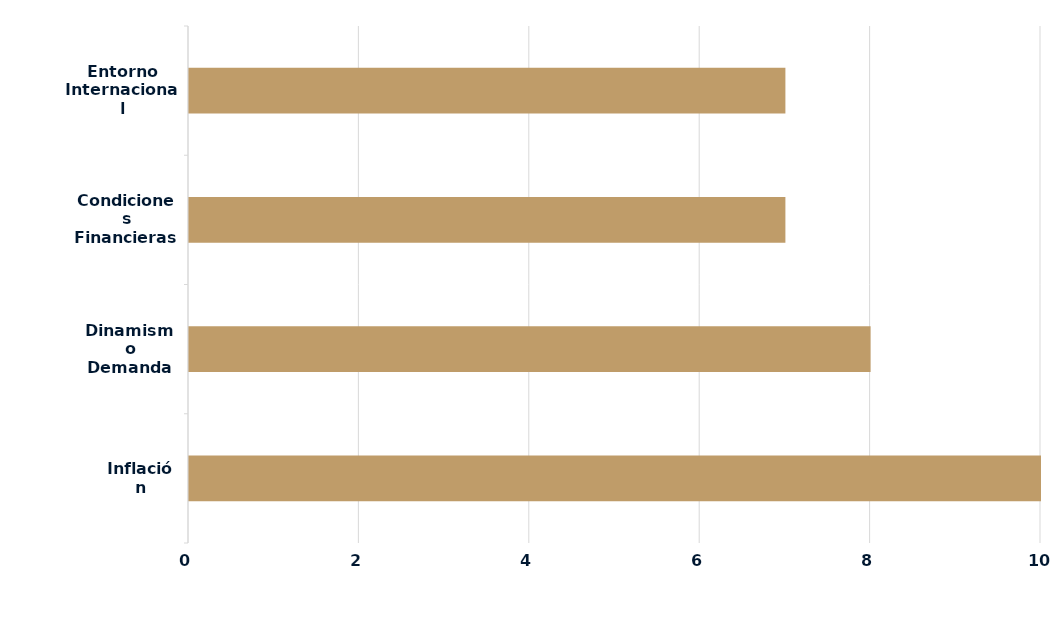
| Category | Series 0 |
|---|---|
| Inflación | 10 |
| Dinamismo Demanda | 8 |
| Condiciones Financieras Locales | 7 |
| Entorno Internacional | 7 |